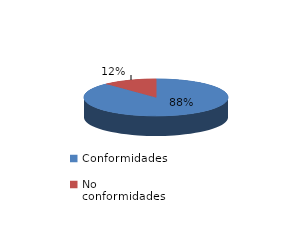
| Category | Series 0 |
|---|---|
| Conformidades | 462 |
| No conformidades | 64 |